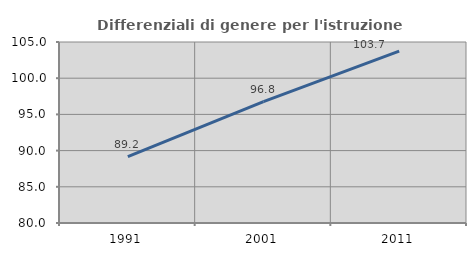
| Category | Differenziali di genere per l'istruzione superiore |
|---|---|
| 1991.0 | 89.182 |
| 2001.0 | 96.763 |
| 2011.0 | 103.741 |